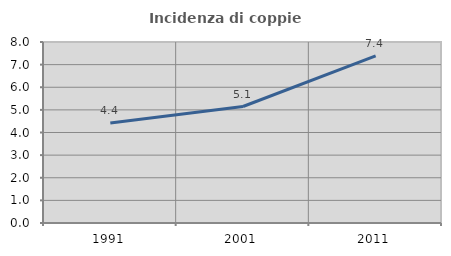
| Category | Incidenza di coppie miste |
|---|---|
| 1991.0 | 4.424 |
| 2001.0 | 5.149 |
| 2011.0 | 7.384 |